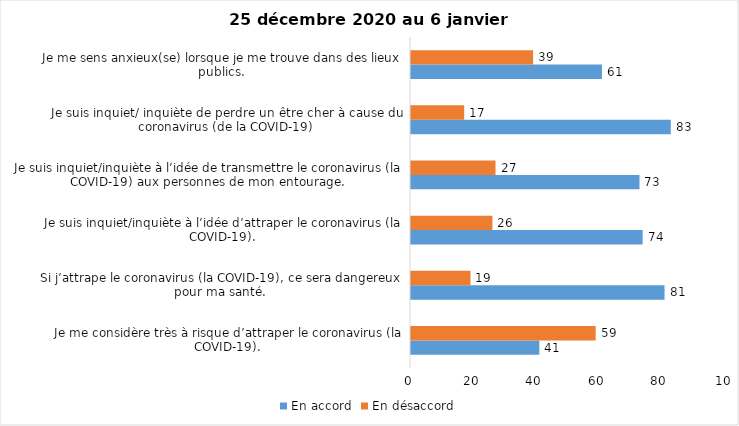
| Category | En accord | En désaccord |
|---|---|---|
| Je me considère très à risque d’attraper le coronavirus (la COVID-19). | 41 | 59 |
| Si j’attrape le coronavirus (la COVID-19), ce sera dangereux pour ma santé. | 81 | 19 |
| Je suis inquiet/inquiète à l’idée d’attraper le coronavirus (la COVID-19). | 74 | 26 |
| Je suis inquiet/inquiète à l’idée de transmettre le coronavirus (la COVID-19) aux personnes de mon entourage. | 73 | 27 |
| Je suis inquiet/ inquiète de perdre un être cher à cause du coronavirus (de la COVID-19) | 83 | 17 |
| Je me sens anxieux(se) lorsque je me trouve dans des lieux publics. | 61 | 39 |